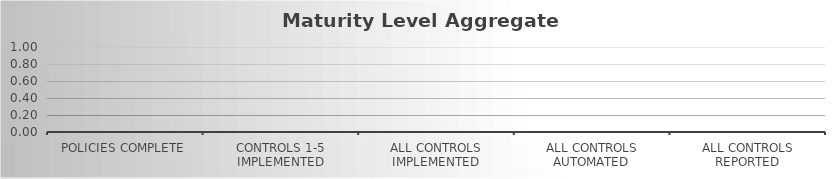
| Category | Score: |
|---|---|
| Policies Complete | 0 |
| Controls 1-5 Implemented | 0 |
| All Controls Implemented | 0 |
| All Controls Automated | 0 |
| All Controls Reported | 0 |